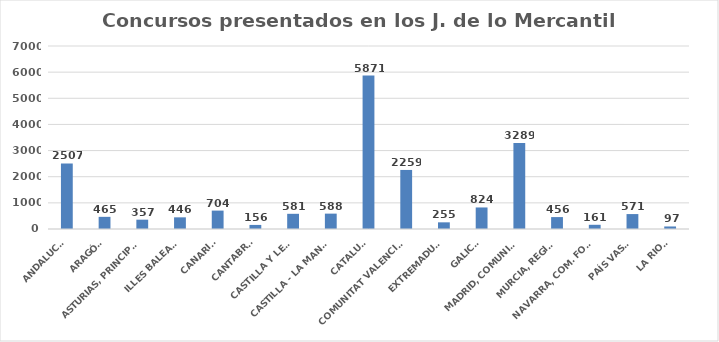
| Category | Series 0 |
|---|---|
| ANDALUCÍA | 2507 |
| ARAGÓN | 465 |
| ASTURIAS, PRINCIPADO | 357 |
| ILLES BALEARS | 446 |
| CANARIAS | 704 |
| CANTABRIA | 156 |
| CASTILLA Y LEÓN | 581 |
| CASTILLA - LA MANCHA | 588 |
| CATALUÑA | 5871 |
| COMUNITAT VALENCIANA | 2259 |
| EXTREMADURA | 255 |
| GALICIA | 824 |
| MADRID, COMUNIDAD | 3289 |
| MURCIA, REGIÓN | 456 |
| NAVARRA, COM. FORAL | 161 |
| PAÍS VASCO | 571 |
| LA RIOJA | 97 |